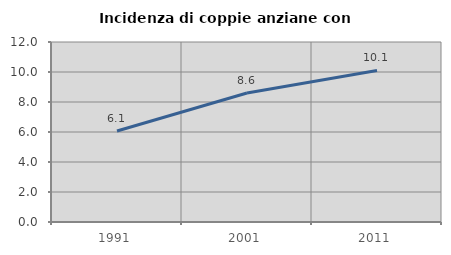
| Category | Incidenza di coppie anziane con figli |
|---|---|
| 1991.0 | 6.07 |
| 2001.0 | 8.604 |
| 2011.0 | 10.105 |